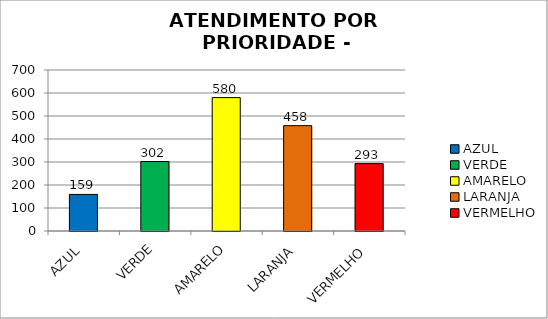
| Category | Total Regional: |
|---|---|
| AZUL | 159 |
| VERDE | 302 |
| AMARELO | 580 |
| LARANJA | 458 |
| VERMELHO | 293 |